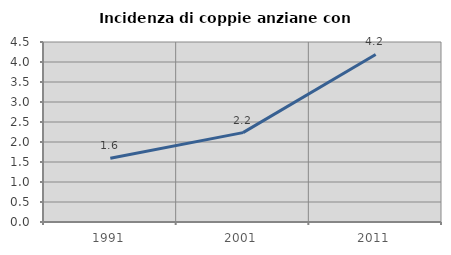
| Category | Incidenza di coppie anziane con figli |
|---|---|
| 1991.0 | 1.596 |
| 2001.0 | 2.235 |
| 2011.0 | 4.188 |